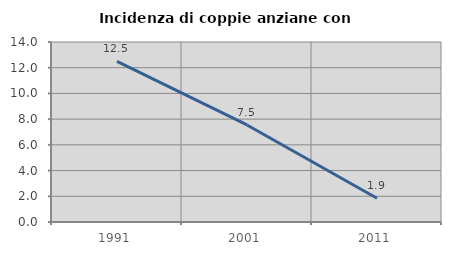
| Category | Incidenza di coppie anziane con figli |
|---|---|
| 1991.0 | 12.5 |
| 2001.0 | 7.547 |
| 2011.0 | 1.852 |